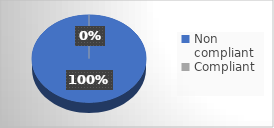
| Category | Series 0 |
|---|---|
| Non compliant | 25 |
| Compliant | 0 |